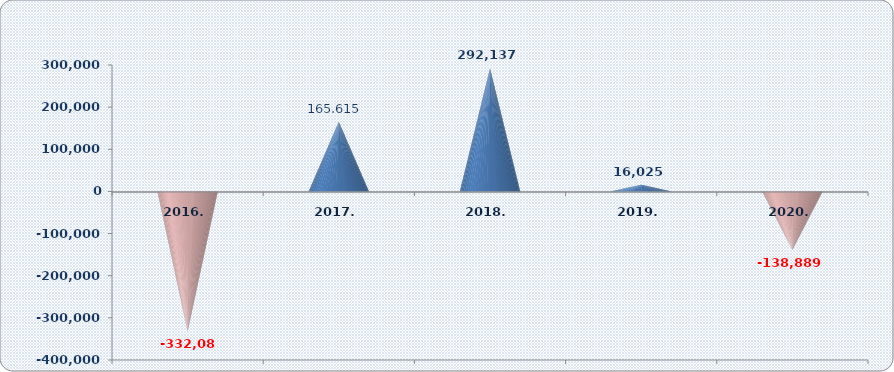
| Category | Dobit razdoblja (+) ili gubitak razdoblja (-)  |
|---|---|
| 2016. | -332084.15 |
| 2017. | 165615 |
| 2018. | 292137 |
| 2019. | 16025 |
| 2020. | -138889.115 |